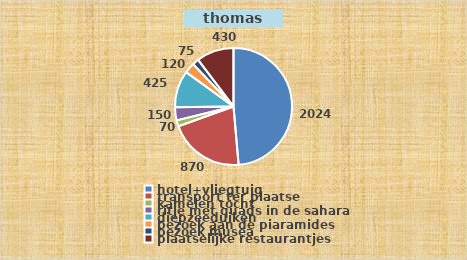
| Category | Series 0 | Series 1 | Series 2 |
|---|---|---|---|
| hotel+vliegtuig |  | 2024 | 17204 |
| transport ter plaatse |  | 870 | 7395 |
| kamelen tocht  |  | 70 | 595 |
| ritje met quads in de sahara |  | 150 | 1275 |
| diepzeeduiken |  | 425 | 3612.5 |
| bezoek aan de piaramides |  | 120 | 1020 |
| bezoek musea |  | 75 | 637.5 |
| plaatselijke restaurantjes |  | 430 | 3655 |